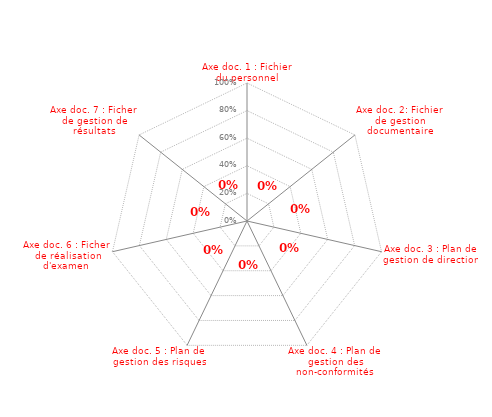
| Category | Axe doc. 1 : Fichier du personnel Axe doc. 2: Fichier de gestion documentaire Axe doc. 3 : Plan de gestion de direction Axe doc. 4 : Plan de gestion des non-conformités Axe doc. 5 : Plan de gestion des risques Axe doc. 6 : Ficher de réalisation d'examen A |
|---|---|
| Axe doc. 1 : Fichier du personnel | 0 |
| Axe doc. 2: Fichier de gestion documentaire | 0 |
| Axe doc. 3 : Plan de gestion de direction | 0 |
| Axe doc. 4 : Plan de gestion des non-conformités | 0 |
| Axe doc. 5 : Plan de gestion des risques | 0 |
| Axe doc. 6 : Ficher de réalisation d'examen | 0 |
| Axe doc. 7 : Ficher de gestion de résultats | 0 |